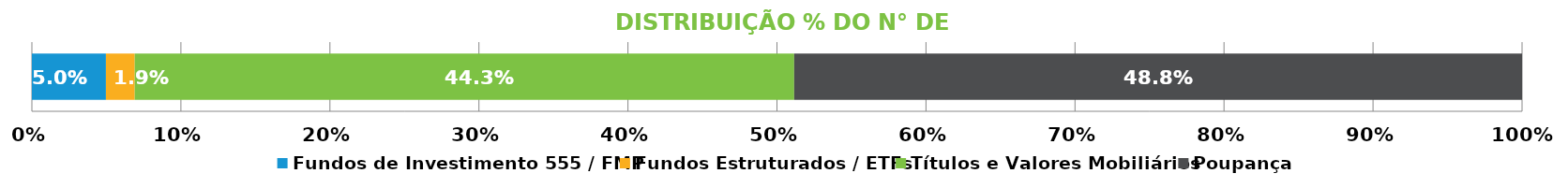
| Category | Fundos de Investimento 555 / FMP | Fundos Estruturados / ETFs | Títulos e Valores Mobiliários | Poupança |
|---|---|---|---|---|
| 0 | 0.05 | 0.019 | 0.443 | 0.488 |